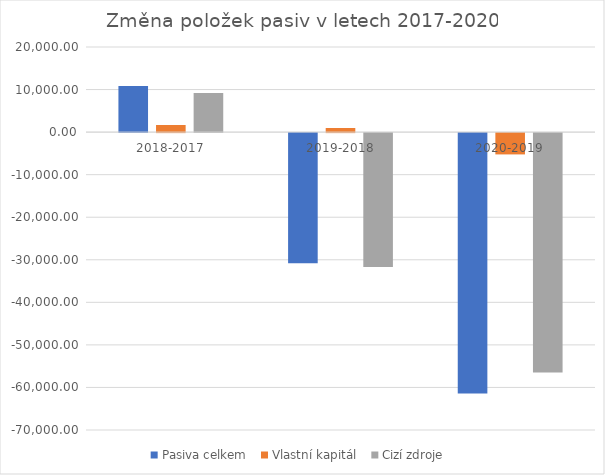
| Category | Pasiva celkem  | Vlastní kapitál  | Cizí zdroje  |
|---|---|---|---|
| 2018-2017 | 10841 | 1672 | 9169 |
| 2019-2018 | -30603 | 968 | -31480 |
| 2020-2019 | -61180 | -5007 | -56264 |